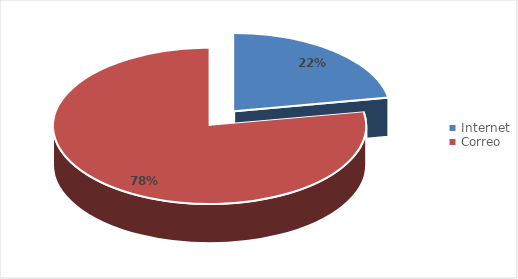
| Category | Series 0 |
|---|---|
| Internet | 6 |
| Correo | 21 |